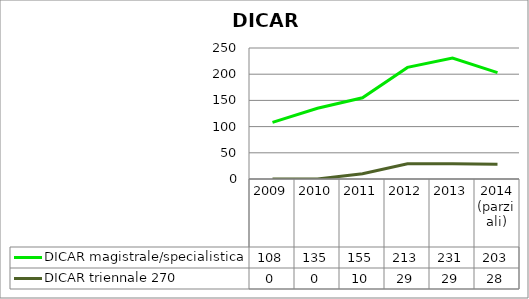
| Category | DICAR magistrale/specialistica | DICAR triennale 270 |
|---|---|---|
| 2009 | 108 | 0 |
| 2010 | 135 | 0 |
| 2011 | 155 | 10 |
| 2012 | 213 | 29 |
| 2013 | 231 | 29 |
| 2014
(parziali) | 203 | 28 |